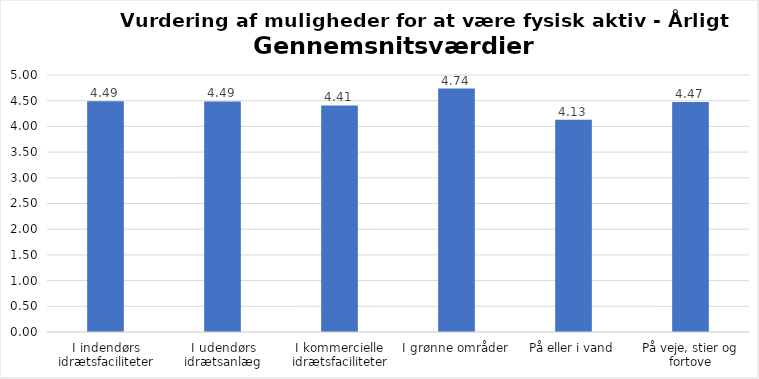
| Category | Gennemsnit |
|---|---|
| I indendørs idrætsfaciliteter | 4.488 |
| I udendørs idrætsanlæg | 4.487 |
| I kommercielle idrætsfaciliteter | 4.407 |
| I grønne områder | 4.736 |
| På eller i vand | 4.128 |
| På veje, stier og fortove | 4.475 |